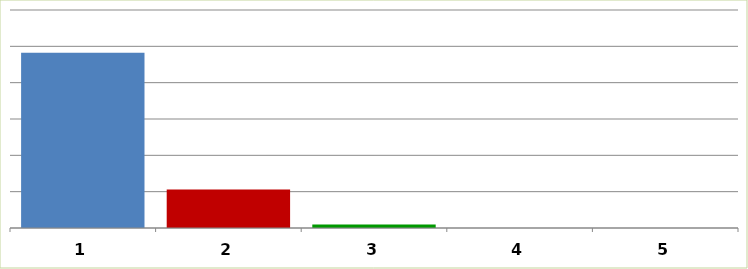
| Category | Series 0 |
|---|---|
| 0 | 2412160181.56 |
| 1 | 530664754.21 |
| 2 | 47064237.92 |
| 3 | 0 |
| 4 | 0 |